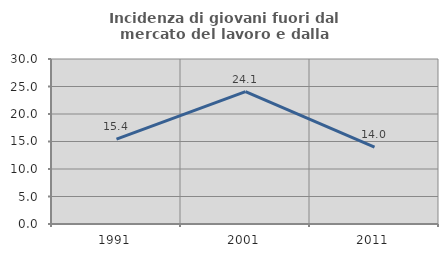
| Category | Incidenza di giovani fuori dal mercato del lavoro e dalla formazione  |
|---|---|
| 1991.0 | 15.436 |
| 2001.0 | 24.066 |
| 2011.0 | 13.961 |